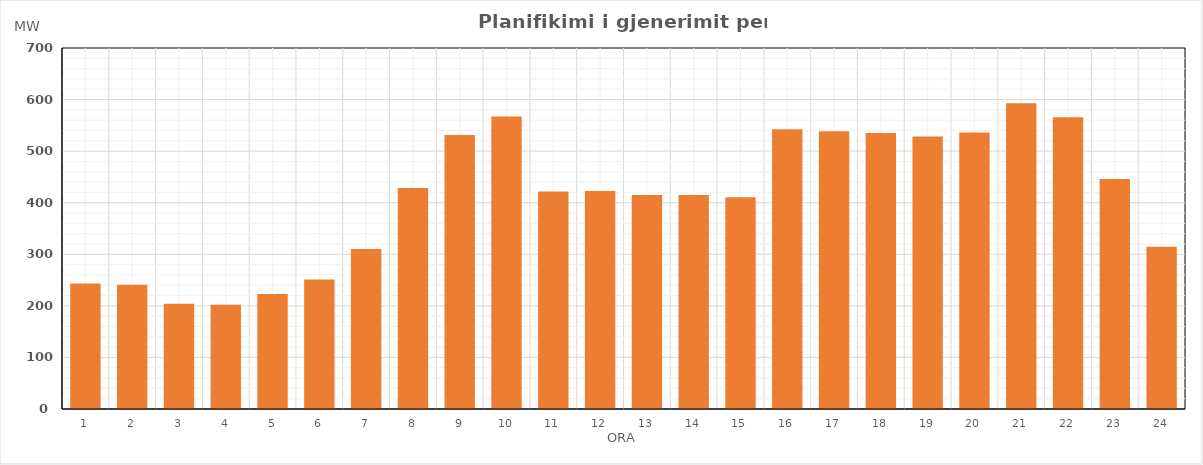
| Category | Max (MW) |
|---|---|
| 0 | 243.204 |
| 1 | 241.164 |
| 2 | 204.034 |
| 3 | 202.004 |
| 4 | 223.04 |
| 5 | 251.103 |
| 6 | 310.178 |
| 7 | 428.708 |
| 8 | 531.243 |
| 9 | 567.408 |
| 10 | 421.733 |
| 11 | 422.924 |
| 12 | 414.757 |
| 13 | 414.794 |
| 14 | 410.698 |
| 15 | 542.409 |
| 16 | 538.414 |
| 17 | 535.385 |
| 18 | 528.373 |
| 19 | 536.363 |
| 20 | 592.644 |
| 21 | 565.524 |
| 22 | 445.959 |
| 23 | 314.81 |